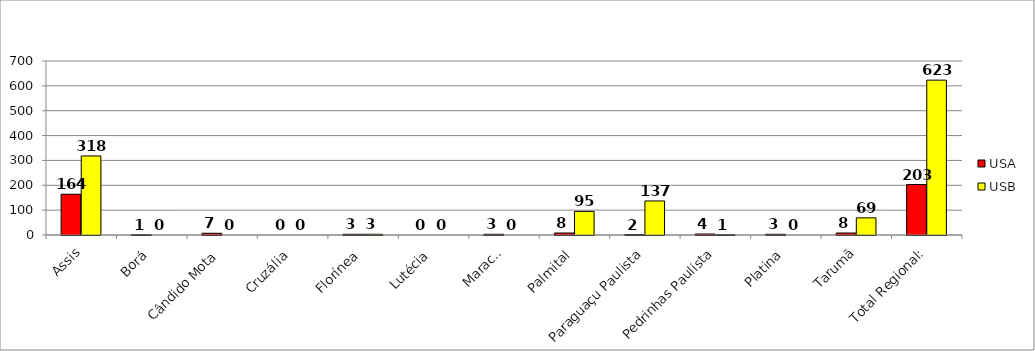
| Category | USA | USB |
|---|---|---|
| Assis | 164 | 318 |
| Borá | 1 | 0 |
| Cândido Mota | 7 | 0 |
| Cruzália | 0 | 0 |
| Florínea | 3 | 3 |
| Lutécia | 0 | 0 |
| Maracaí | 3 | 0 |
| Palmital | 8 | 95 |
| Paraguaçu Paulista | 2 | 137 |
| Pedrinhas Paulista | 4 | 1 |
| Platina | 3 | 0 |
| Tarumã | 8 | 69 |
| Total Regional: | 203 | 623 |